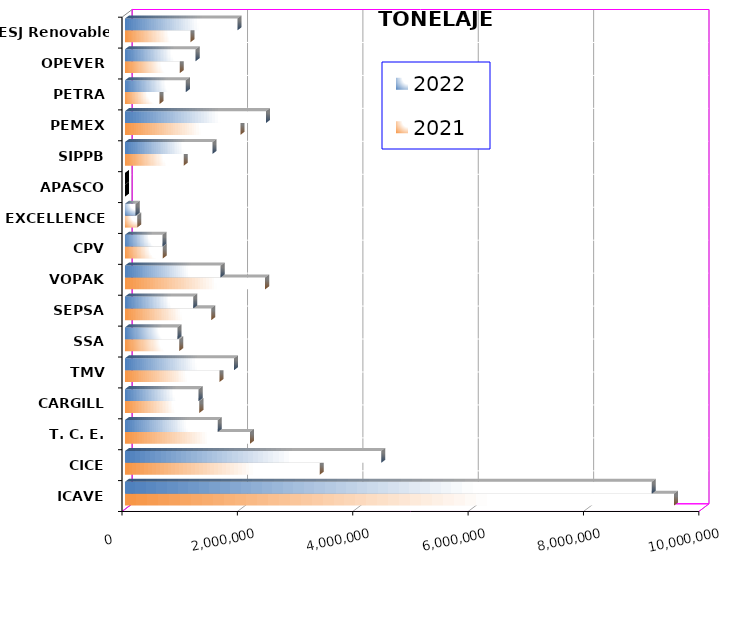
| Category | 2021 | 2022 |
|---|---|---|
| ICAVE | 9517164.915 | 9130953.895 |
| CICE | 3376748.847 | 4442844.308 |
| T. C. E. | 2165891.384 | 1607268.803 |
| CARGILL | 1289103.918 | 1276377.891 |
| TMV | 1638282.61 | 1890827.547 |
| SSA | 940380.433 | 909798.06 |
| SEPSA | 1493827.13 | 1184288.07 |
| VOPAK | 2429441.759 | 1657297.07 |
| CPV | 655755.538 | 650551.05 |
| EXCELLENCE | 210847.246 | 183900.917 |
| APASCO | 0 | 0 |
| SIPPB | 1017670.317 | 1518161.49 |
| PEMEX | 2001805.823 | 2444818.433 |
| PETRA | 599692.33 | 1055214.66 |
| OPEVER | 950398.138 | 1224244.849 |
| ESJ Renovable III | 1136205.176 | 1950146.604 |